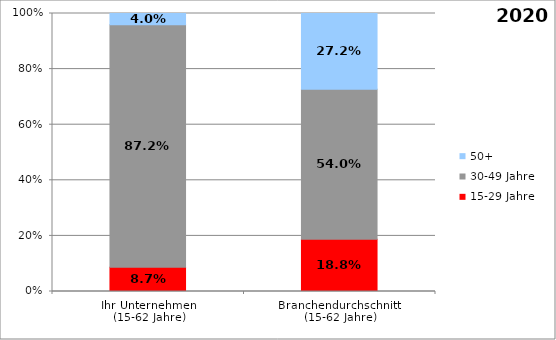
| Category | 15-29 Jahre | 30-49 Jahre | 50+ |
|---|---|---|---|
| Ihr Unternehmen 
(15-62 Jahre) | 0.087 | 0.872 | 0.04 |
| Branchendurchschnitt 
(15-62 Jahre) | 0.188 | 0.54 | 0.272 |